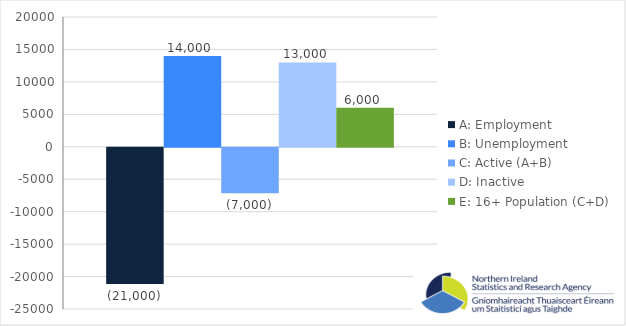
| Category | A: Employment | B: Unemployment | C: Active (A+B) | D: Inactive | E: 16+ Population (C+D) |
|---|---|---|---|---|---|
| 0 | -21000 | 14000 | -7000 | 13000 | 6000 |